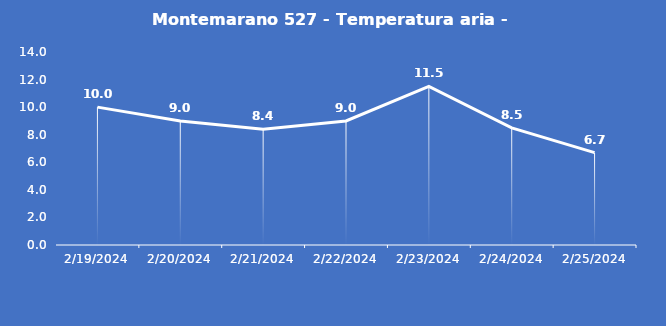
| Category | Montemarano 527 - Temperatura aria - Grezzo (°C) |
|---|---|
| 2/19/24 | 10 |
| 2/20/24 | 9 |
| 2/21/24 | 8.4 |
| 2/22/24 | 9 |
| 2/23/24 | 11.5 |
| 2/24/24 | 8.5 |
| 2/25/24 | 6.7 |